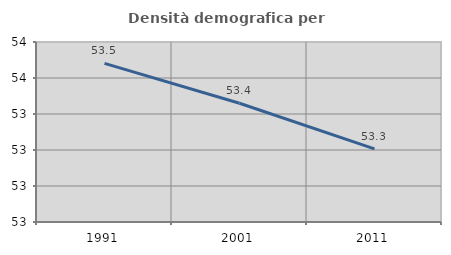
| Category | Densità demografica |
|---|---|
| 1991.0 | 53.541 |
| 2001.0 | 53.43 |
| 2011.0 | 53.303 |